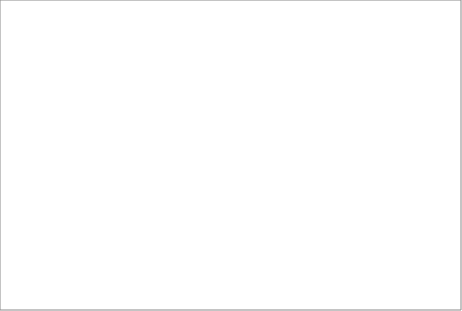
| Category | 2008 | 2009 | 2010 | 2011 | 2012 | 2013 |
|---|---|---|---|---|---|---|
| łódzkie |  | 9 | 11 | 1 | 6 | 9 |